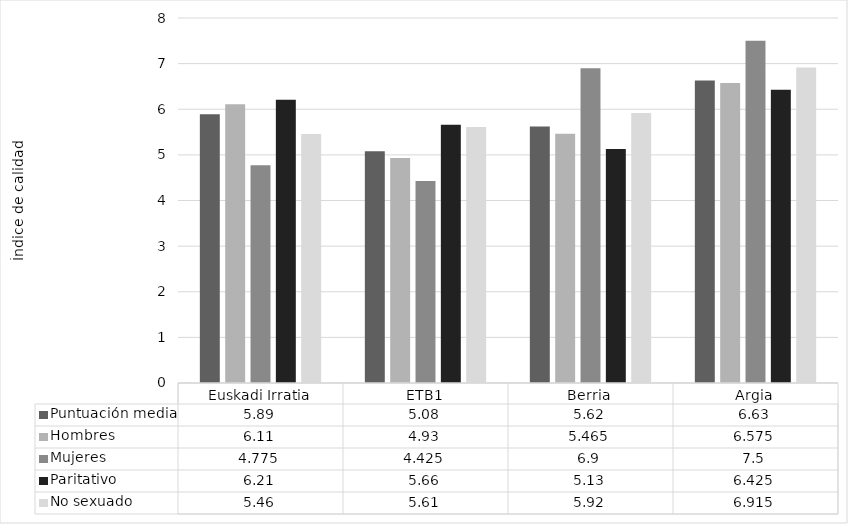
| Category | Puntuación media | Hombres | Mujeres | Paritativo | No sexuado |
|---|---|---|---|---|---|
| Euskadi Irratia | 5.89 | 6.11 | 4.775 | 6.21 | 5.46 |
| ETB1 | 5.08 | 4.93 | 4.425 | 5.66 | 5.61 |
| Berria | 5.62 | 5.465 | 6.9 | 5.13 | 5.92 |
| Argia | 6.63 | 6.575 | 7.5 | 6.425 | 6.915 |